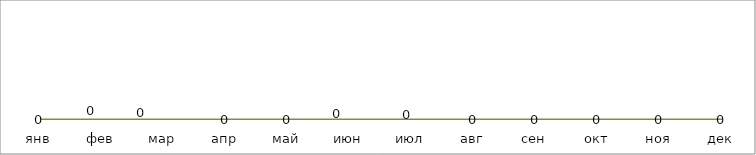
| Category | Series 0 |
|---|---|
| янв | 0 |
| фев | 0 |
| мар | 0 |
| апр | 0 |
| май | 0 |
| июн | 0 |
| июл | 0 |
| авг | 0 |
| сен | 0 |
| окт | 0 |
| ноя | 0 |
| дек | 0 |